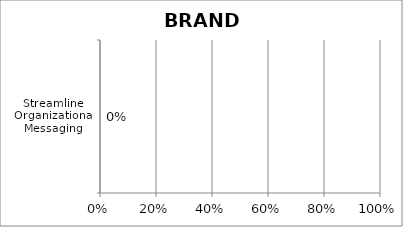
| Category | Series 0 |
|---|---|
| Streamline Organizational Messaging | 0 |